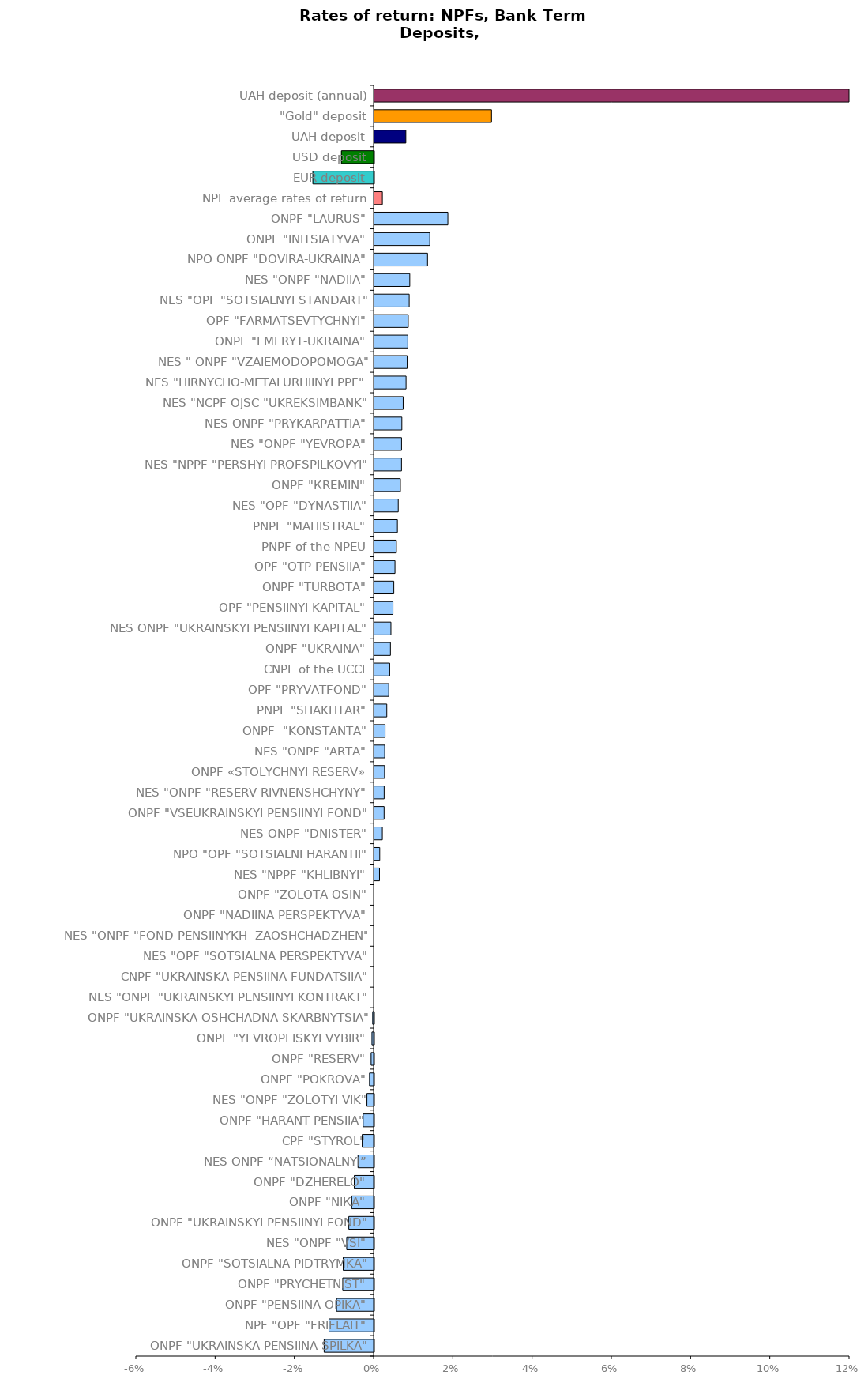
| Category | Series 0 |
|---|---|
| ONPF "UKRAINSKA PENSIINA SPILKA" | -0.013 |
| NPF "OPF "FRIFLAIT" | -0.011 |
| ONPF "PENSIINA OPIKA" | -0.009 |
| ONPF "PRYCHETNIST" | -0.008 |
| ONPF "SOTSIALNA PIDTRYMKA" | -0.008 |
| NES "ONPF "VSI" | -0.007 |
| ONPF "UKRAINSKYI PENSIINYI FOND" | -0.006 |
| ONPF "NIКА" | -0.006 |
| ONPF "DZHERELO" | -0.005 |
| NES ONPF “NATSIONALNYI” | -0.004 |
| CPF "STYROL" | -0.003 |
| ONPF "HARANT-PENSIIA" | -0.003 |
| NES "ONPF "ZOLOTYI VIK" | -0.002 |
| ONPF "POKROVA" | -0.001 |
| ONPF "RESERV" | -0.001 |
| ONPF "YEVROPEISKYI VYBIR" | -0.001 |
| ONPF "UKRAINSKA OSHCHADNA SKARBNYTSIA" | 0 |
| NES "ONPF "UKRAINSKYI PENSIINYI KONTRAKT" | 0 |
| CNPF "UKRAINSKA PENSIINA FUNDATSIIA" | 0 |
| NES "OPF "SOTSIALNA PERSPEKTYVA" | 0 |
| NES "ONPF "FOND PENSIINYKH  ZAOSHCHADZHEN" | 0 |
| ONPF "NADIINA PERSPEKTYVA" | 0 |
| ONPF "ZOLOTA OSIN" | 0 |
| NES "NPPF "KHLIBNYI" | 0.001 |
| NPO "OPF "SOTSIALNI HARANTII" | 0.001 |
| NES ONPF "DNISTER" | 0.002 |
| ONPF "VSEUKRAINSKYI PENSIINYI FOND" | 0.002 |
| NES "ONPF "RESERV RIVNENSHCHYNY" | 0.002 |
| ONPF «STOLYCHNYI RESERV» | 0.003 |
| NES "ONPF "АRТА" | 0.003 |
| ONPF  "KONSTANTA" | 0.003 |
| PNPF "SHAKHTAR" | 0.003 |
| OPF "PRYVATFOND" | 0.004 |
| CNPF of the UCCI | 0.004 |
| ONPF "UKRAINA" | 0.004 |
| NES ONPF "UKRAINSKYI PENSIINYI KAPITAL" | 0.004 |
| OPF "PENSIINYI KAPITAL" | 0.005 |
| ONPF "TURBOTA" | 0.005 |
| OPF "ОТP PENSIIA" | 0.005 |
| PNPF of the NPEU | 0.006 |
| PNPF "МAHISTRAL" | 0.006 |
| NES "OPF "DYNASTIIA" | 0.006 |
| ONPF "КREMIN" | 0.007 |
| NES "NPPF "PERSHYI PROFSPILKOVYI" | 0.007 |
| NES "ONPF "YEVROPA" | 0.007 |
| NES ONPF "PRYKARPATTIA" | 0.007 |
| NES "NCPF OJSC "UKREKSIMBANK" | 0.007 |
| NES "HIRNYCHO-METALURHIINYI PPF" | 0.008 |
| NES " ONPF "VZAIEMODOPOMOGA" | 0.008 |
| ONPF "ЕMERYT-UKRAINA" | 0.008 |
| OPF "FARMATSEVTYCHNYI" | 0.009 |
| NES "OPF "SOTSIALNYI STANDART" | 0.009 |
| NES "ONPF "NADIIA" | 0.009 |
| NPO ONPF "DOVIRA-UKRAINA" | 0.013 |
| ONPF "INITSIATYVA" | 0.014 |
| ONPF "LAURUS" | 0.019 |
| NPF average rates of return | 0.002 |
| EUR deposit | -0.015 |
| USD deposit | -0.008 |
| UAH deposit | 0.008 |
| "Gold" deposit | 0.03 |
| UAH deposit (annual) | 0.121 |